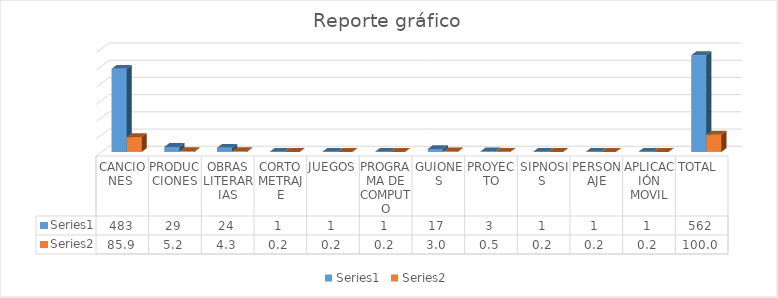
| Category | Series 0 | Series 1 |
|---|---|---|
| CANCIONES  | 483 | 85.943 |
| PRODUCCIONES | 29 | 5.16 |
| OBRAS LITERARIAS | 24 | 4.27 |
| CORTOMETRAJE | 1 | 0.178 |
| JUEGOS | 1 | 0.178 |
| PROGRAMA DE COMPUTO | 1 | 0.178 |
| GUIONES | 17 | 3.025 |
| PROYECTO | 3 | 0.534 |
| SIPNOSIS  | 1 | 0.178 |
| PERSONAJE | 1 | 0.178 |
| APLICACIÓN MOVIL | 1 | 0.178 |
| TOTAL  | 562 | 100 |